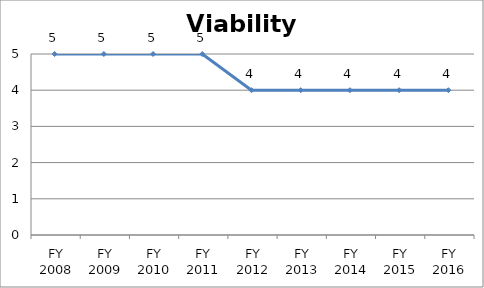
| Category | Viability score |
|---|---|
| FY 2016 | 4 |
| FY 2015 | 4 |
| FY 2014 | 4 |
| FY 2013 | 4 |
| FY 2012 | 4 |
| FY 2011 | 5 |
| FY 2010 | 5 |
| FY 2009 | 5 |
| FY 2008 | 5 |